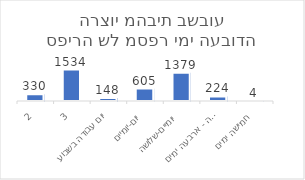
| Category | סה"כ |
|---|---|
| 2 | 330 |
| 3 | 1534 |
| יום עבודה בשבוע | 148 |
| יום-יומיים | 605 |
| יומיים-שלושה | 1379 |
| שלושה - ארבעה ימים | 224 |
| חמישה ימים | 4 |